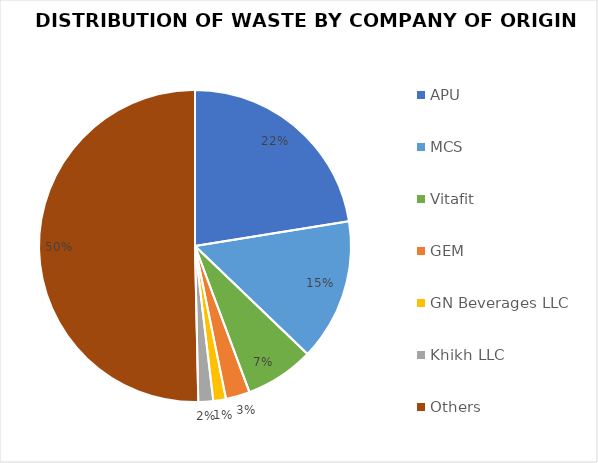
| Category | Series 0 |
|---|---|
| APU | 4503 |
| MCS | 2950 |
| Vitafit | 1433 |
| GEM | 499 |
| GN Beverages LLC | 263 |
| Khikh LLC | 308 |
| Others | 10091 |